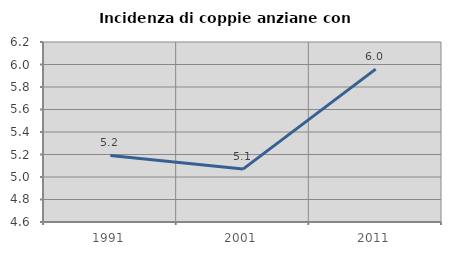
| Category | Incidenza di coppie anziane con figli |
|---|---|
| 1991.0 | 5.191 |
| 2001.0 | 5.07 |
| 2011.0 | 5.959 |